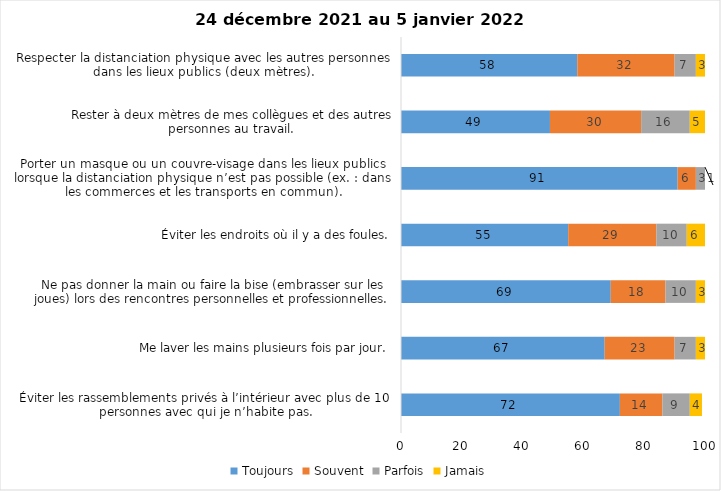
| Category | Toujours | Souvent | Parfois | Jamais |
|---|---|---|---|---|
| Éviter les rassemblements privés à l’intérieur avec plus de 10 personnes avec qui je n’habite pas. | 72 | 14 | 9 | 4 |
| Me laver les mains plusieurs fois par jour. | 67 | 23 | 7 | 3 |
| Ne pas donner la main ou faire la bise (embrasser sur les joues) lors des rencontres personnelles et professionnelles. | 69 | 18 | 10 | 3 |
| Éviter les endroits où il y a des foules. | 55 | 29 | 10 | 6 |
| Porter un masque ou un couvre-visage dans les lieux publics lorsque la distanciation physique n’est pas possible (ex. : dans les commerces et les transports en commun). | 91 | 6 | 3 | 1 |
| Rester à deux mètres de mes collègues et des autres personnes au travail. | 49 | 30 | 16 | 5 |
| Respecter la distanciation physique avec les autres personnes dans les lieux publics (deux mètres). | 58 | 32 | 7 | 3 |